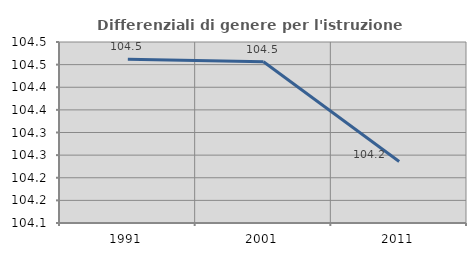
| Category | Differenziali di genere per l'istruzione superiore |
|---|---|
| 1991.0 | 104.462 |
| 2001.0 | 104.457 |
| 2011.0 | 104.236 |